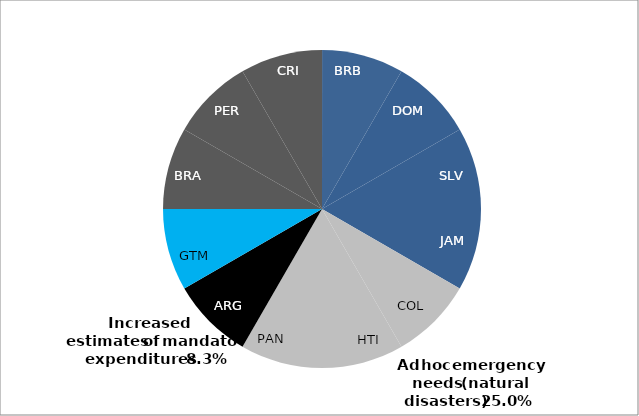
| Category | Series 0 |
|---|---|
| BRB | 1 |
| DOM | 1 |
| SLV | 1 |
| JAM | 1 |
| COL | 1 |
| HTI | 1 |
| PAN | 1 |
| ARG | 1 |
| GTM | 1 |
| BRA | 1 |
| PER | 1 |
| CRI | 1 |